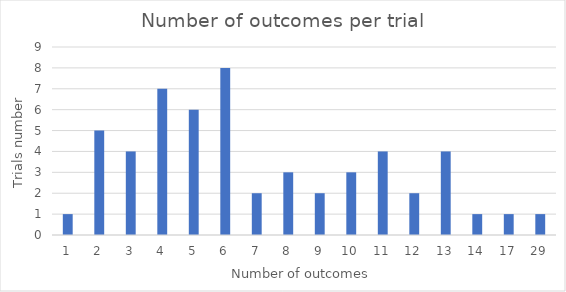
| Category | Series 0 |
|---|---|
| 1.0 | 1 |
| 2.0 | 5 |
| 3.0 | 4 |
| 4.0 | 7 |
| 5.0 | 6 |
| 6.0 | 8 |
| 7.0 | 2 |
| 8.0 | 3 |
| 9.0 | 2 |
| 10.0 | 3 |
| 11.0 | 4 |
| 12.0 | 2 |
| 13.0 | 4 |
| 14.0 | 1 |
| 17.0 | 1 |
| 29.0 | 1 |